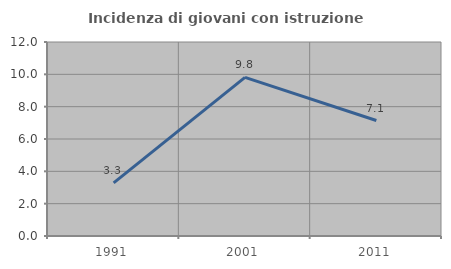
| Category | Incidenza di giovani con istruzione universitaria |
|---|---|
| 1991.0 | 3.289 |
| 2001.0 | 9.816 |
| 2011.0 | 7.143 |